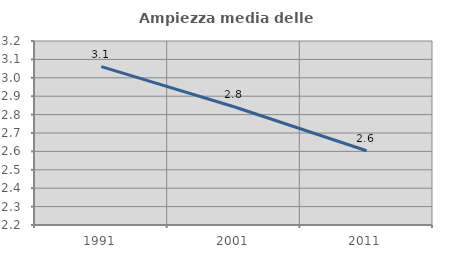
| Category | Ampiezza media delle famiglie |
|---|---|
| 1991.0 | 3.061 |
| 2001.0 | 2.843 |
| 2011.0 | 2.603 |